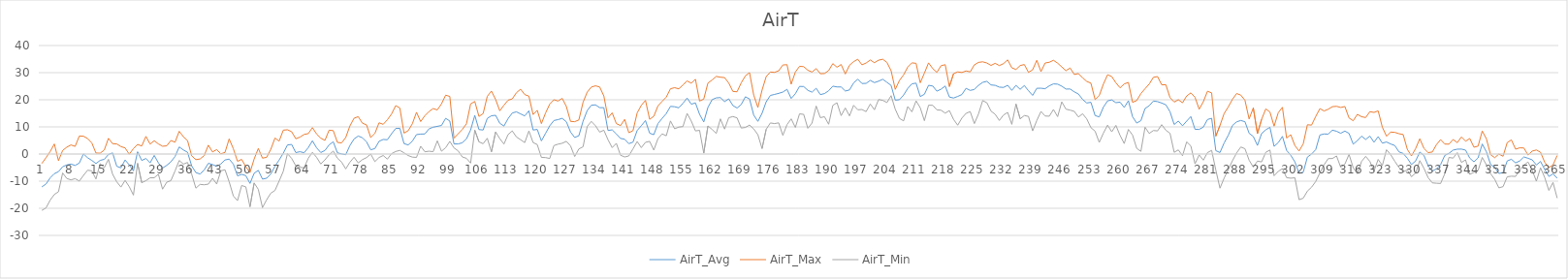
| Category | AirT_Avg | AirT_Max | AirT_Min |
|---|---|---|---|
| 0 | -12.11 | -3.48 | -20.76 |
| 1 | -11.06 | -1.36 | -19.88 |
| 2 | -8.8 | 0.91 | -17.01 |
| 3 | -7.25 | 3.71 | -14.91 |
| 4 | -6.5 | -2.46 | -13.9 |
| 5 | -4.68 | 1.32 | -6.99 |
| 6 | -4.02 | 2.53 | -9.01 |
| 7 | -3.72 | 3.35 | -9.52 |
| 8 | -4.2 | 2.82 | -9.07 |
| 9 | -3.34 | 6.62 | -9.98 |
| 10 | 0.04 | 6.57 | -7.89 |
| 11 | -1.37 | 5.71 | -5.96 |
| 12 | -2.35 | 4.12 | -6.2 |
| 13 | -3.5 | 0.37 | -9.21 |
| 14 | -2.35 | 0.31 | -3.54 |
| 15 | -1.95 | 1.48 | -5.02 |
| 16 | -0.15 | 5.78 | -1.95 |
| 17 | 0.42 | 3.82 | -7.46 |
| 18 | -4.53 | 3.71 | -10.26 |
| 19 | -5.08 | 2.75 | -12.18 |
| 20 | -2.19 | 2.26 | -9.72 |
| 21 | -4.01 | -0.07 | -12.04 |
| 22 | -6.21 | 2.01 | -15.15 |
| 23 | 0.84 | 3.54 | -3.41 |
| 24 | -2.37 | 2.96 | -10.56 |
| 25 | -1.64 | 6.5 | -9.82 |
| 26 | -3.26 | 3.68 | -8.77 |
| 27 | -0.51 | 4.89 | -8.74 |
| 28 | -3.26 | 3.73 | -7.45 |
| 29 | -5.17 | 2.87 | -12.95 |
| 30 | -4.18 | 3.02 | -10.38 |
| 31 | -2.86 | 4.98 | -9.81 |
| 32 | -0.91 | 4.36 | -6.23 |
| 33 | 2.62 | 8.39 | -2.36 |
| 34 | 1.5 | 6.38 | -3.71 |
| 35 | 0.65 | 4.96 | -3.11 |
| 36 | -4.4 | -0.67 | -7.42 |
| 37 | -6.84 | -2.07 | -12.58 |
| 38 | -7.37 | -1.83 | -11.19 |
| 39 | -5.9 | -0.57 | -11.33 |
| 40 | -3.41 | 3.27 | -11.09 |
| 41 | -3.88 | 0.77 | -8.94 |
| 42 | -4.53 | 1.64 | -11.06 |
| 43 | -3.66 | 0.07 | -6.2 |
| 44 | -2.19 | 0.61 | -5.8 |
| 45 | -1.86 | 5.58 | -10.23 |
| 46 | -3.71 | 1.97 | -15.46 |
| 47 | -8.02 | -2.68 | -17.18 |
| 48 | -7.49 | -1.98 | -11.6 |
| 49 | -7.96 | -4.69 | -12.11 |
| 50 | -10.84 | -6.84 | -19.45 |
| 51 | -7.08 | -1.82 | -10.66 |
| 52 | -6.02 | 2.05 | -13.02 |
| 53 | -9.24 | -1.52 | -19.75 |
| 54 | -8.92 | -1.21 | -16.88 |
| 55 | -7.35 | 1.74 | -14.44 |
| 56 | -4.5 | 5.89 | -13.43 |
| 57 | -2.21 | 4.77 | -9.96 |
| 58 | 0.32 | 8.79 | -6.37 |
| 59 | 3.34 | 8.95 | 0.17 |
| 60 | 3.54 | 8.24 | -1.62 |
| 61 | 0.54 | 5.64 | -4.32 |
| 62 | 0.86 | 6.23 | -4.89 |
| 63 | 0.48 | 7.21 | -5.09 |
| 64 | 2.37 | 7.53 | -1.55 |
| 65 | 4.88 | 9.73 | 0.64 |
| 66 | 2.29 | 7.39 | -1.22 |
| 67 | 0.56 | 5.86 | -3.67 |
| 68 | 1.31 | 5.02 | -2.15 |
| 69 | 3.37 | 8.78 | -0.27 |
| 70 | 4.52 | 8.63 | 1.08 |
| 71 | 0.45 | 4.29 | -1.54 |
| 72 | 0.05 | 4.1 | -2.96 |
| 73 | -0.26 | 6.08 | -5.49 |
| 74 | 3.14 | 10.34 | -3.02 |
| 75 | 5.56 | 13.2 | -1.18 |
| 76 | 6.63 | 13.78 | -3.27 |
| 77 | 6.01 | 11.38 | -2.06 |
| 78 | 4.48 | 10.74 | -1.31 |
| 79 | 1.56 | 6.08 | 0 |
| 80 | 2.01 | 7.6 | -2.8 |
| 81 | 4.69 | 11.52 | -1.28 |
| 82 | 5.37 | 10.95 | -0.54 |
| 83 | 5.27 | 12.63 | -1.88 |
| 84 | 7.47 | 14.76 | 0.13 |
| 85 | 9.43 | 17.83 | 0.94 |
| 86 | 9.48 | 16.97 | 1.35 |
| 87 | 3.84 | 7.72 | 0.44 |
| 88 | 3.35 | 8.59 | -0.56 |
| 89 | 4.74 | 11.15 | -1.14 |
| 90 | 7.17 | 15.39 | -1.24 |
| 91 | 7.35 | 11.97 | 2.87 |
| 92 | 7.4 | 14.12 | 0.84 |
| 93 | 9.28 | 15.67 | 1.04 |
| 94 | 9.89 | 16.75 | 0.88 |
| 95 | 10.2 | 16.27 | 4.86 |
| 96 | 10.52 | 18.49 | 1.04 |
| 97 | 13.16 | 21.7 | 2.33 |
| 98 | 12.17 | 21.23 | 4.66 |
| 99 | 3.73 | 5.84 | 2.26 |
| 100 | 3.72 | 7.45 | 1.18 |
| 101 | 4.15 | 9.06 | -1.08 |
| 102 | 5.6 | 11.15 | -1.58 |
| 103 | 8.87 | 18.49 | -3.33 |
| 104 | 14.25 | 19.37 | 8.8 |
| 105 | 9.02 | 13.87 | 4.49 |
| 106 | 8.86 | 14.9 | 3.81 |
| 107 | 13.14 | 21.26 | 5.81 |
| 108 | 14.11 | 23.22 | 0.81 |
| 109 | 14.28 | 20.12 | 8.12 |
| 110 | 11.35 | 15.94 | 5.67 |
| 111 | 10.31 | 17.99 | 3.68 |
| 112 | 13.07 | 19.84 | 7.19 |
| 113 | 15.12 | 20.32 | 8.53 |
| 114 | 15.56 | 22.61 | 6.3 |
| 115 | 14.81 | 23.9 | 5.28 |
| 116 | 14.06 | 21.91 | 4.22 |
| 117 | 15.94 | 21.33 | 8.52 |
| 118 | 8.86 | 14.56 | 4.24 |
| 119 | 9.07 | 16.12 | 3.49 |
| 120 | 4.85 | 11.22 | -1.24 |
| 121 | 7.62 | 15.13 | -1.31 |
| 122 | 10.4 | 18.39 | -1.65 |
| 123 | 12.35 | 20.01 | 3.11 |
| 124 | 12.69 | 19.53 | 3.64 |
| 125 | 13.15 | 20.52 | 3.97 |
| 126 | 11.88 | 17.5 | 4.68 |
| 127 | 8.11 | 12.03 | 3 |
| 128 | 6.1 | 11.93 | -0.91 |
| 129 | 6.75 | 12.57 | 1.89 |
| 130 | 12.05 | 19.03 | 2.67 |
| 131 | 16.02 | 22.81 | 10.15 |
| 132 | 18 | 24.7 | 12.04 |
| 133 | 18.12 | 25.14 | 10.41 |
| 134 | 17.1 | 24.71 | 8.09 |
| 135 | 17.09 | 21.4 | 8.78 |
| 136 | 8.68 | 13.34 | 5.29 |
| 137 | 8.92 | 15.2 | 2.36 |
| 138 | 7.42 | 11.23 | 3.95 |
| 139 | 5.77 | 10.47 | -0.44 |
| 140 | 5.46 | 12.77 | -1.08 |
| 141 | 3.83 | 7.87 | -0.7 |
| 142 | 4.37 | 8.6 | 1.92 |
| 143 | 8.66 | 15.13 | 4.62 |
| 144 | 10.45 | 17.97 | 2.36 |
| 145 | 12.34 | 19.78 | 4.32 |
| 146 | 7.68 | 12.81 | 4.66 |
| 147 | 7.13 | 13.92 | 1.46 |
| 148 | 11.25 | 17.76 | 5.67 |
| 149 | 13.14 | 19.41 | 7.42 |
| 150 | 14.92 | 20.99 | 6.74 |
| 151 | 17.57 | 24.06 | 12.19 |
| 152 | 17.44 | 24.46 | 9.3 |
| 153 | 17.04 | 24.03 | 9.93 |
| 154 | 18.69 | 25.47 | 10.12 |
| 155 | 20.64 | 26.94 | 14.97 |
| 156 | 18.38 | 26.13 | 12.16 |
| 157 | 18.86 | 27.56 | 8.53 |
| 158 | 14.63 | 19.53 | 8.73 |
| 159 | 11.82 | 20.25 | 0.33 |
| 160 | 17.18 | 26.18 | 10.36 |
| 161 | 20.05 | 27.28 | 9.06 |
| 162 | 20.7 | 28.61 | 7.58 |
| 163 | 20.82 | 28.33 | 12.97 |
| 164 | 19.33 | 28.17 | 9.2 |
| 165 | 20.34 | 26.18 | 13.38 |
| 166 | 17.88 | 23.07 | 13.82 |
| 167 | 16.96 | 22.96 | 13.34 |
| 168 | 18.25 | 26.25 | 9.58 |
| 169 | 21.1 | 28.83 | 9.8 |
| 170 | 20.3 | 30 | 10.69 |
| 171 | 14.35 | 21.73 | 9.26 |
| 172 | 12.04 | 17.16 | 7.12 |
| 173 | 15.01 | 23.56 | 2.02 |
| 174 | 19.27 | 28.56 | 9.13 |
| 175 | 21.6 | 30.22 | 11.46 |
| 176 | 21.98 | 30.11 | 11.22 |
| 177 | 22.37 | 30.67 | 11.5 |
| 178 | 22.85 | 32.83 | 6.87 |
| 179 | 23.86 | 32.94 | 10.84 |
| 180 | 20.47 | 25.75 | 12.97 |
| 181 | 22.23 | 30.22 | 9.81 |
| 182 | 24.93 | 32.33 | 14.8 |
| 183 | 24.88 | 32.22 | 14.63 |
| 184 | 23.49 | 30.89 | 9.49 |
| 185 | 22.82 | 30.22 | 11.42 |
| 186 | 24.25 | 31.5 | 17.7 |
| 187 | 21.91 | 29.61 | 13.41 |
| 188 | 22.29 | 29.67 | 13.75 |
| 189 | 23.33 | 30.78 | 10.98 |
| 190 | 25.02 | 33.33 | 17.94 |
| 191 | 24.74 | 32 | 18.91 |
| 192 | 24.72 | 33 | 14.16 |
| 193 | 23.22 | 29.5 | 16.98 |
| 194 | 23.63 | 32.72 | 14.06 |
| 195 | 26.21 | 34.06 | 17.96 |
| 196 | 27.58 | 34.94 | 16.32 |
| 197 | 26 | 32.89 | 16.41 |
| 198 | 26.05 | 33.56 | 15.64 |
| 199 | 27.13 | 34.67 | 18.44 |
| 200 | 26.33 | 33.67 | 16.32 |
| 201 | 26.86 | 34.61 | 20.09 |
| 202 | 27.56 | 34.94 | 19.78 |
| 203 | 26.44 | 33.78 | 18.98 |
| 204 | 25.31 | 30.72 | 21.51 |
| 205 | 19.86 | 23.83 | 16.52 |
| 206 | 20.02 | 27.11 | 13.14 |
| 207 | 21.74 | 29.17 | 12.23 |
| 208 | 24.19 | 32.06 | 17.5 |
| 209 | 25.87 | 33.61 | 15.57 |
| 210 | 26.14 | 33.44 | 19.59 |
| 211 | 21.19 | 26.26 | 17.06 |
| 212 | 22.03 | 29.83 | 12.3 |
| 213 | 25.34 | 33.61 | 18 |
| 214 | 25.07 | 31.5 | 17.96 |
| 215 | 23.18 | 30.11 | 16.27 |
| 216 | 23.91 | 32.56 | 16.15 |
| 217 | 25.07 | 32.94 | 15.07 |
| 218 | 21.01 | 24.88 | 16.01 |
| 219 | 20.65 | 29.61 | 12.77 |
| 220 | 21.23 | 30.28 | 10.62 |
| 221 | 21.93 | 30.06 | 13.24 |
| 222 | 24.22 | 30.61 | 15 |
| 223 | 23.46 | 30.28 | 15.64 |
| 224 | 23.8 | 32.89 | 11.22 |
| 225 | 25.34 | 33.78 | 14.8 |
| 226 | 26.42 | 34 | 19.72 |
| 227 | 26.8 | 33.56 | 18.91 |
| 228 | 25.47 | 32.67 | 15.81 |
| 229 | 25.32 | 33.44 | 14.66 |
| 230 | 24.67 | 32.61 | 12.37 |
| 231 | 24.55 | 33.33 | 14.39 |
| 232 | 25.35 | 34.72 | 15.34 |
| 233 | 23.46 | 31.78 | 10.94 |
| 234 | 25.31 | 31.17 | 18.43 |
| 235 | 23.85 | 32.61 | 12.97 |
| 236 | 25.25 | 33 | 14.19 |
| 237 | 23.33 | 30.11 | 13.88 |
| 238 | 21.62 | 31.06 | 8.53 |
| 239 | 24.24 | 34.56 | 12.37 |
| 240 | 24.26 | 30.39 | 15.71 |
| 241 | 24.08 | 33.56 | 14.02 |
| 242 | 25.15 | 33.83 | 13.95 |
| 243 | 25.86 | 34.56 | 16.42 |
| 244 | 25.77 | 33.5 | 13.78 |
| 245 | 25.02 | 32.11 | 19.24 |
| 246 | 23.96 | 30.72 | 16.55 |
| 247 | 23.97 | 31.72 | 16.18 |
| 248 | 22.93 | 29.33 | 15.73 |
| 249 | 22.12 | 29.67 | 13.65 |
| 250 | 20.15 | 28.11 | 14.83 |
| 251 | 18.82 | 26.78 | 12.95 |
| 252 | 19.07 | 26.12 | 9.71 |
| 253 | 14.19 | 20.07 | 8.43 |
| 254 | 13.68 | 21.53 | 4.29 |
| 255 | 17.29 | 25.81 | 7.72 |
| 256 | 19.59 | 29.22 | 10.66 |
| 257 | 19.95 | 28.56 | 8.19 |
| 258 | 18.93 | 26.26 | 10.56 |
| 259 | 19.13 | 24.41 | 6.86 |
| 260 | 17.17 | 25.84 | 3.87 |
| 261 | 19.63 | 26.39 | 9.07 |
| 262 | 13.77 | 19.06 | 6.98 |
| 263 | 11.42 | 19.71 | 2.09 |
| 264 | 12.29 | 22.28 | 0.98 |
| 265 | 16.78 | 24.09 | 9.88 |
| 266 | 17.81 | 25.78 | 7.58 |
| 267 | 19.53 | 28.28 | 8.67 |
| 268 | 19.32 | 28.56 | 8.53 |
| 269 | 18.8 | 25.52 | 10.83 |
| 270 | 18.15 | 25.54 | 8.77 |
| 271 | 15.59 | 20.79 | 7.65 |
| 272 | 10.89 | 19.17 | 0.64 |
| 273 | 12.15 | 20.01 | 1.52 |
| 274 | 10.41 | 18.9 | -0.64 |
| 275 | 12.14 | 21.4 | 4.49 |
| 276 | 13.82 | 22.55 | 3 |
| 277 | 9.12 | 20.93 | -3.61 |
| 278 | 9.07 | 16.51 | -0.31 |
| 279 | 9.93 | 19.27 | -2.26 |
| 280 | 12.73 | 23.15 | 0.54 |
| 281 | 13.18 | 22.54 | 1.35 |
| 282 | 1.24 | 6.58 | -5.93 |
| 283 | 0.56 | 10.54 | -12.58 |
| 284 | 4.08 | 14.93 | -8.87 |
| 285 | 6.92 | 17.39 | -5.7 |
| 286 | 10.54 | 20.18 | -2.46 |
| 287 | 11.87 | 22.31 | 0.41 |
| 288 | 12.37 | 21.73 | 2.59 |
| 289 | 11.92 | 19.82 | 1.96 |
| 290 | 7.64 | 12.93 | -2.28 |
| 291 | 6.48 | 17.03 | -4.82 |
| 292 | 3.17 | 7.53 | -2.61 |
| 293 | 7.56 | 12.8 | -2.9 |
| 294 | 8.93 | 16.63 | 0.64 |
| 295 | 9.84 | 15.49 | 1.48 |
| 296 | 2.83 | 10.27 | -8.01 |
| 297 | 4.19 | 15.23 | -6.4 |
| 298 | 6.51 | 17.23 | -5.38 |
| 299 | 1.34 | 5.89 | -8.71 |
| 300 | -0.45 | 7.12 | -8.91 |
| 301 | -2.92 | 3.1 | -8.76 |
| 302 | -7.14 | 1.12 | -16.83 |
| 303 | -6.7 | 3.77 | -16.29 |
| 304 | -1.13 | 10.79 | -13.66 |
| 305 | 0 | 10.66 | -12.23 |
| 306 | 1.64 | 13.84 | -10.12 |
| 307 | 7.01 | 16.74 | -6.96 |
| 308 | 7.39 | 15.87 | -3.98 |
| 309 | 7.34 | 16.52 | -1.69 |
| 310 | 8.79 | 17.46 | -1.65 |
| 311 | 8.4 | 17.59 | -0.72 |
| 312 | 7.65 | 17.17 | -4.88 |
| 313 | 8.46 | 17.51 | -3.73 |
| 314 | 7.61 | 13.29 | -0.13 |
| 315 | 3.66 | 12.28 | -5.05 |
| 316 | 4.94 | 14.62 | -7.27 |
| 317 | 6.6 | 13.76 | -2.74 |
| 318 | 5.37 | 13.45 | -0.86 |
| 319 | 6.61 | 15.62 | -2.71 |
| 320 | 4.35 | 15.34 | -6.22 |
| 321 | 6.41 | 15.91 | -1.99 |
| 322 | 4.02 | 9.9 | -4.23 |
| 323 | 4.44 | 6.57 | 1.58 |
| 324 | 3.72 | 8.08 | -0.23 |
| 325 | 3.13 | 7.98 | -2.69 |
| 326 | 0.8 | 7.49 | -4.97 |
| 327 | 0.23 | 7.18 | -6.56 |
| 328 | -1.53 | 1.74 | -5.84 |
| 329 | -3.88 | -0.71 | -8.36 |
| 330 | -2.55 | 2.03 | -7 |
| 331 | 0.72 | 5.63 | -2.43 |
| 332 | -0.55 | 2.07 | -5.28 |
| 333 | -4.3 | 0.54 | -8.72 |
| 334 | -6.28 | 0.74 | -10.63 |
| 335 | -5.49 | 3.46 | -10.76 |
| 336 | -3.87 | 5.32 | -10.84 |
| 337 | -0.5 | 3.68 | -7.24 |
| 338 | 0.25 | 3.64 | -1.26 |
| 339 | 1.44 | 5.36 | -1.51 |
| 340 | 1.79 | 4.21 | 0.53 |
| 341 | 1.82 | 6.29 | -3.09 |
| 342 | 1.43 | 4.72 | -2.16 |
| 343 | -1.51 | 5.72 | -7.5 |
| 344 | -2.87 | 2.52 | -6.74 |
| 345 | -1.42 | 2.91 | -6.04 |
| 346 | 3.71 | 8.49 | -1.26 |
| 347 | 0.82 | 5.6 | -4.01 |
| 348 | -3.84 | -0.24 | -7.24 |
| 349 | -4.92 | -1.34 | -9.35 |
| 350 | -7.17 | -0.02 | -12.47 |
| 351 | -6.86 | -0.81 | -12.02 |
| 352 | -2.54 | 4.24 | -8.38 |
| 353 | -1.94 | 5.21 | -8.18 |
| 354 | -3.26 | 1.81 | -8.25 |
| 355 | -2.55 | 2.29 | -5.91 |
| 356 | -1.08 | 2.23 | -4.07 |
| 357 | -1.57 | -0.38 | -2.95 |
| 358 | -2.14 | 1.09 | -5.98 |
| 359 | -4.03 | 1.49 | -10.01 |
| 360 | -2.73 | 0.66 | -5.07 |
| 361 | -5.68 | -3.04 | -8.64 |
| 362 | -8.26 | -5 | -13.41 |
| 363 | -7.33 | -4.02 | -10.47 |
| 364 | -8.92 | -0.53 | -16.24 |